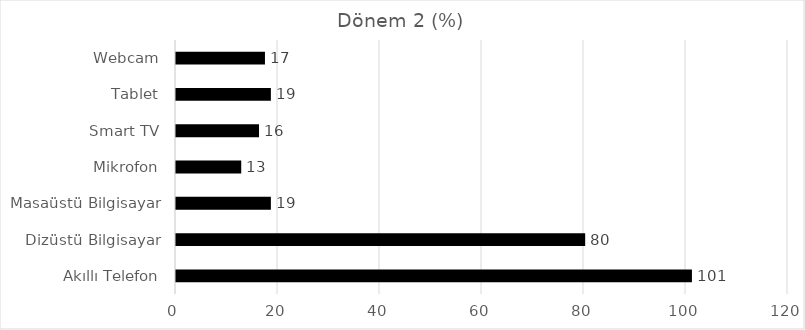
| Category | Dönem 2 (%) |
|---|---|
| Akıllı Telefon | 101.163 |
| Dizüstü Bilgisayar | 80.233 |
| Masaüstü Bilgisayar | 18.605 |
| Mikrofon | 12.791 |
| Smart TV | 16.279 |
| Tablet | 18.605 |
| Webcam | 17.442 |